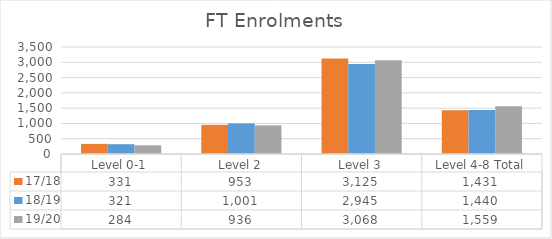
| Category | 17/18 | 18/19 | 19/20 |
|---|---|---|---|
| Level 0-1 | 331 | 321 | 284 |
| Level 2 | 953 | 1001 | 936 |
| Level 3 | 3125 | 2945 | 3068 |
| Level 4-8 Total | 1431 | 1440 | 1559 |